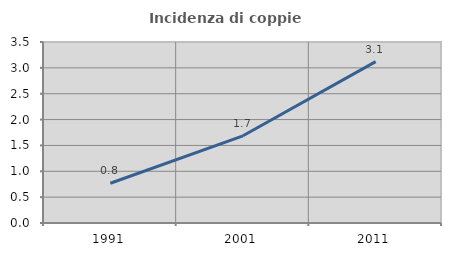
| Category | Incidenza di coppie miste |
|---|---|
| 1991.0 | 0.768 |
| 2001.0 | 1.686 |
| 2011.0 | 3.122 |